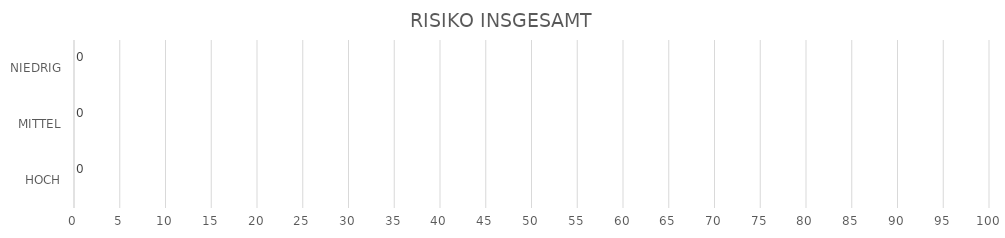
| Category | Series 1 | Series 0 |
|---|---|---|
| HOCH | 0 | 0 |
| MITTEL | 0 | 0 |
| NIEDRIG | 0 | 0 |